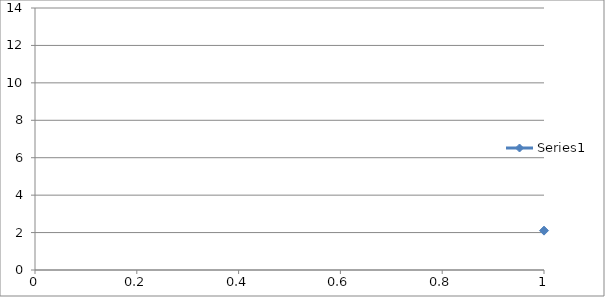
| Category | Series 0 |
|---|---|
| 0 | 2.104 |
| 1 | 6.311 |
| 2 | 10.986 |
| 3 | 13.206 |
| 4 | 11.629 |
| 5 | 8.94 |
| 6 | 6.898 |
| 7 | 5.458 |
| 8 | 4.28 |
| 9 | 3.092 |
| 10 | 2.068 |